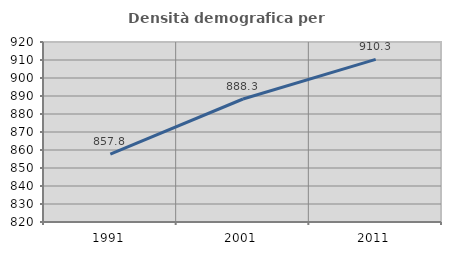
| Category | Densità demografica |
|---|---|
| 1991.0 | 857.771 |
| 2001.0 | 888.337 |
| 2011.0 | 910.324 |